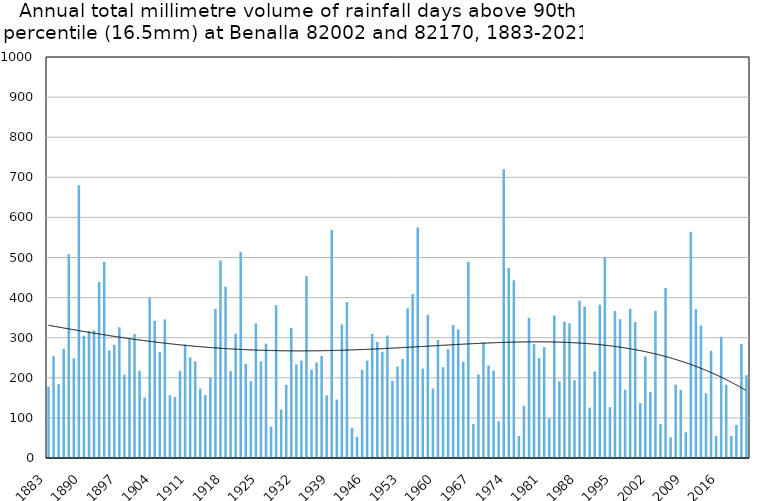
| Category | Annual total mm in days above 90th percentile |
|---|---|
| 1883 | 177.6 |
| 1884 | 253.8 |
| 1885 | 183.9 |
| 1886 | 272.2 |
| 1887 | 508.2 |
| 1888 | 249 |
| 1889 | 680.1 |
| 1890 | 305.3 |
| 1891 | 316.4 |
| 1892 | 318.2 |
| 1893 | 438.9 |
| 1894 | 489.2 |
| 1895 | 268.6 |
| 1896 | 282.4 |
| 1897 | 326.1 |
| 1898 | 207.6 |
| 1899 | 296.5 |
| 1900 | 309 |
| 1901 | 217.6 |
| 1902 | 151 |
| 1903 | 399.3 |
| 1904 | 342.2 |
| 1905 | 264.9 |
| 1906 | 345.4 |
| 1907 | 156.3 |
| 1908 | 152.1 |
| 1909 | 217.5 |
| 1910 | 282.9 |
| 1911 | 250.5 |
| 1912 | 240.9 |
| 1913 | 173 |
| 1914 | 156.9 |
| 1915 | 200.7 |
| 1916 | 372 |
| 1917 | 492.7 |
| 1918 | 427.1 |
| 1919 | 216.7 |
| 1920 | 310 |
| 1921 | 513.5 |
| 1922 | 234.6 |
| 1923 | 191.5 |
| 1924 | 335.5 |
| 1925 | 241 |
| 1926 | 285.3 |
| 1927 | 77.8 |
| 1928 | 380.9 |
| 1929 | 120.8 |
| 1930 | 182.4 |
| 1931 | 324.6 |
| 1932 | 233.5 |
| 1933 | 243.2 |
| 1934 | 453.4 |
| 1935 | 220.4 |
| 1936 | 238.3 |
| 1937 | 254.6 |
| 1938 | 156 |
| 1939 | 568.3 |
| 1940 | 145.8 |
| 1941 | 333.3 |
| 1942 | 388.8 |
| 1943 | 75.4 |
| 1944 | 52.8 |
| 1945 | 219.3 |
| 1946 | 242.9 |
| 1947 | 309.3 |
| 1948 | 289.8 |
| 1949 | 264 |
| 1950 | 305.4 |
| 1951 | 192.8 |
| 1952 | 227.9 |
| 1953 | 246.8 |
| 1954 | 373.2 |
| 1955 | 408.4 |
| 1956 | 574.7 |
| 1957 | 222.9 |
| 1958 | 357.1 |
| 1959 | 173.4 |
| 1960 | 294.2 |
| 1961 | 226.4 |
| 1962 | 271 |
| 1963 | 331.5 |
| 1964 | 320.6 |
| 1965 | 239.9 |
| 1966 | 489.2 |
| 1967 | 84.9 |
| 1968 | 208.2 |
| 1969 | 288 |
| 1970 | 230.6 |
| 1971 | 218.2 |
| 1972 | 91.5 |
| 1973 | 719.8 |
| 1974 | 474 |
| 1975 | 443.2 |
| 1976 | 54.8 |
| 1977 | 130.4 |
| 1978 | 349.4 |
| 1979 | 283.8 |
| 1980 | 249.3 |
| 1981 | 276.4 |
| 1982 | 98.6 |
| 1983 | 355.3 |
| 1984 | 191.2 |
| 1985 | 340.2 |
| 1986 | 335.8 |
| 1987 | 193.6 |
| 1988 | 392.3 |
| 1989 | 377.6 |
| 1990 | 125.6 |
| 1991 | 215.8 |
| 1992 | 382.4 |
| 1993 | 500.6 |
| 1994 | 126.8 |
| 1995 | 366.4 |
| 1996 | 346.2 |
| 1997 | 170.2 |
| 1998 | 371.8 |
| 1999 | 339 |
| 2000 | 136.8 |
| 2001 | 253.6 |
| 2002 | 164.8 |
| 2003 | 367 |
| 2004 | 84.4 |
| 2005 | 424 |
| 2006 | 52 |
| 2007 | 183 |
| 2008 | 169.6 |
| 2009 | 64.1 |
| 2010 | 564 |
| 2011 | 371 |
| 2012 | 330.5 |
| 2013 | 161.4 |
| 2014 | 267.2 |
| 2015 | 55.2 |
| 2016 | 302.3 |
| 2017 | 182.7 |
| 2018 | 55.1 |
| 2019 | 82.7 |
| 2020 | 284.8 |
| 2021 | 206.3 |